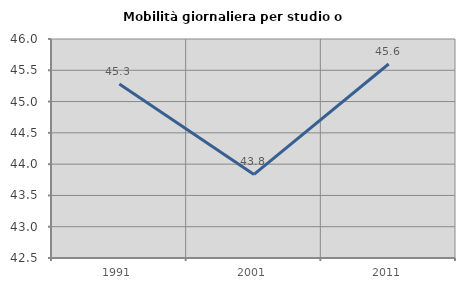
| Category | Mobilità giornaliera per studio o lavoro |
|---|---|
| 1991.0 | 45.283 |
| 2001.0 | 43.836 |
| 2011.0 | 45.601 |